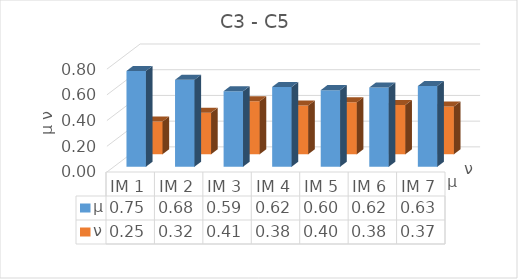
| Category | μ | ν |
|---|---|---|
| IM 1 | 0.745 | 0.255 |
| IM 2 | 0.677 | 0.323 |
| IM 3 | 0.588 | 0.412 |
| IM 4 | 0.621 | 0.379 |
| IM 5 | 0.596 | 0.404 |
| IM 6 | 0.617 | 0.383 |
| IM 7 | 0.628 | 0.372 |